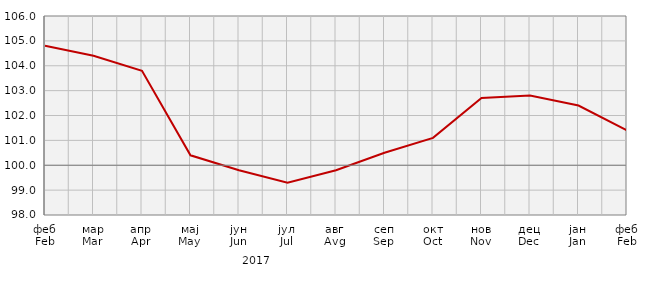
| Category | Индекси цијена произвођача
Producer price indices |
|---|---|
| феб
Feb | 104.8 |
| мар
Mar | 104.4 |
| апр
Apr | 103.8 |
| мај
May | 100.4 |
| јун
Jun | 99.8 |
| јул
Jul | 99.3 |
| авг
Avg | 99.8 |
| сеп
Sep | 100.5 |
| окт
Oct | 101.1 |
| нов
Nov | 102.7 |
| дец
Dec | 102.8 |
| јан
Jan | 102.4 |
| феб
Feb | 101.4 |